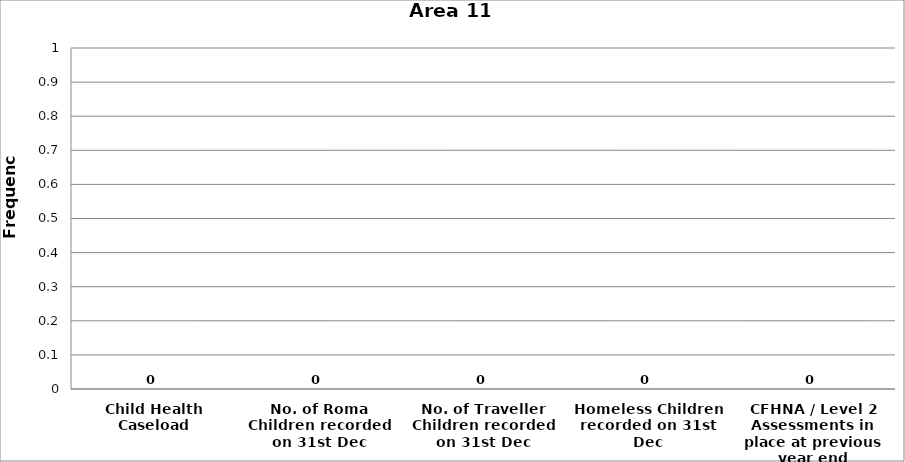
| Category | Area 11 |
|---|---|
| Child Health Caseload | 0 |
| No. of Roma Children recorded on 31st Dec | 0 |
| No. of Traveller Children recorded on 31st Dec | 0 |
| Homeless Children recorded on 31st Dec | 0 |
| CFHNA / Level 2 Assessments in place at previous year end | 0 |